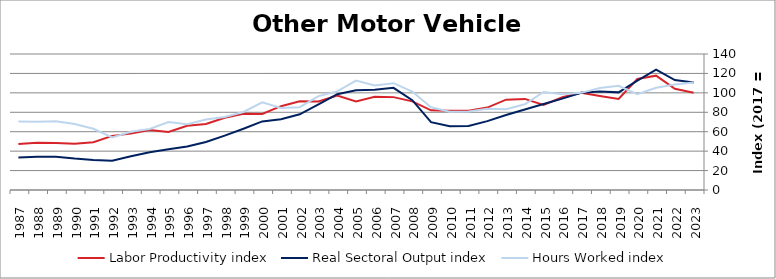
| Category | Labor Productivity index | Real Sectoral Output index | Hours Worked index |
|---|---|---|---|
| 2023.0 | 100.016 | 110.739 | 110.721 |
| 2022.0 | 104.177 | 113.122 | 108.586 |
| 2021.0 | 117.68 | 123.885 | 105.273 |
| 2020.0 | 114.233 | 112.617 | 98.586 |
| 2019.0 | 93.63 | 100.504 | 107.342 |
| 2018.0 | 96.686 | 101.467 | 104.945 |
| 2017.0 | 100 | 100 | 100 |
| 2016.0 | 95.482 | 94.062 | 98.512 |
| 2015.0 | 87.649 | 88.471 | 100.938 |
| 2014.0 | 93.76 | 82.792 | 88.302 |
| 2013.0 | 93.012 | 77.281 | 83.087 |
| 2012.0 | 84.857 | 70.902 | 83.555 |
| 2011.0 | 81.641 | 65.976 | 80.812 |
| 2010.0 | 81.475 | 65.559 | 80.465 |
| 2009.0 | 82.033 | 69.806 | 85.095 |
| 2008.0 | 91.242 | 92.425 | 101.297 |
| 2007.0 | 95.608 | 105.151 | 109.981 |
| 2006.0 | 95.989 | 103.276 | 107.592 |
| 2005.0 | 91.095 | 102.637 | 112.671 |
| 2004.0 | 97.128 | 98.629 | 101.545 |
| 2003.0 | 91.111 | 88.028 | 96.615 |
| 2002.0 | 91.418 | 77.949 | 85.267 |
| 2001.0 | 86.298 | 72.883 | 84.455 |
| 2000.0 | 78.257 | 70.625 | 90.247 |
| 1999.0 | 78.526 | 63.066 | 80.312 |
| 1998.0 | 74.441 | 56 | 75.228 |
| 1997.0 | 67.998 | 49.341 | 72.563 |
| 1996.0 | 66.051 | 44.748 | 67.748 |
| 1995.0 | 59.822 | 41.847 | 69.952 |
| 1994.0 | 61.868 | 38.82 | 62.747 |
| 1993.0 | 58.036 | 34.797 | 59.958 |
| 1992.0 | 55.73 | 30.112 | 54.031 |
| 1991.0 | 49.146 | 30.958 | 62.991 |
| 1990.0 | 47.6 | 32.354 | 67.971 |
| 1989.0 | 48.42 | 34.236 | 70.706 |
| 1988.0 | 48.538 | 34.146 | 70.349 |
| 1987.0 | 47.457 | 33.482 | 70.551 |